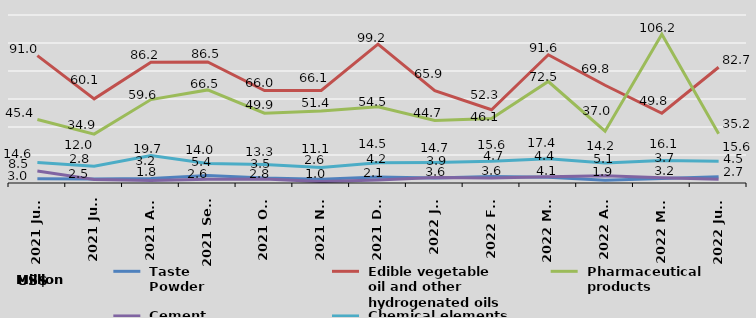
| Category |  Taste 
 Powder |  Edible vegetable 
 oil and other 
 hydrogenated oils |  Pharmaceutical   
 products |  Cement |  Chemical elements
 and compounds |
|---|---|---|---|---|---|
| 2021 June | 3 | 91 | 45.4 | 8.5 | 14.6 |
| 2021 July | 2.8 | 60.1 | 34.9 | 2.5 | 12 |
| 2021 Aug | 3.2 | 86.2 | 59.6 | 1.8 | 19.7 |
| 2021 Sept | 5.4 | 86.5 | 66.5 | 2.6 | 14 |
| 2021 Oct | 3.5 | 66 | 49.9 | 2.8 | 13.3 |
| 2021 Nov | 2.6 | 66.1 | 51.4 | 1 | 11.1 |
| 2021 Dec | 4.2 | 99.2 | 54.5 | 2.1 | 14.5 |
| 2022 Jan | 3.6 | 65.9 | 44.7 | 3.9 | 14.7 |
| 2022 Feb | 4.7 | 52.3 | 46.1 | 3.6 | 15.6 |
| 2022 Mar | 4.1 | 91.6 | 72.5 | 4.4 | 17.4 |
| 2022 Apr | 1.9 | 69.8 | 37 | 5.1 | 14.2 |
| 2022 May | 3.2 | 49.8 | 106.2 | 3.7 | 16.1 |
| 2022 June | 4.5 | 82.7 | 35.2 | 2.7 | 15.6 |